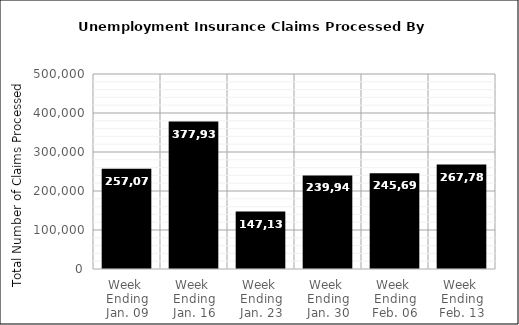
| Category | Series 0 |
|---|---|
| Week 
Ending
Jan. 09 | 257072 |
| Week 
Ending
Jan. 16 | 377936 |
| Week 
Ending
Jan. 23 | 147138.9 |
| Week 
Ending
Jan. 30 | 239945 |
| Week 
Ending
Feb. 06 | 245690.75 |
| Week 
Ending
Feb. 13 | 267780.417 |